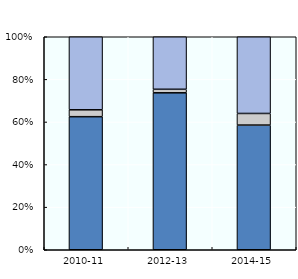
| Category | Multilateral ODA | Multi-bi/non-core | Bilateral ODA, excl. multi-bi  |
|---|---|---|---|
| 2010-11 | 2473.68 | 127.816 | 1357.79 |
| 2012-13 | 2405.488 | 54.123 | 804.938 |
| 2014-15 | 2612.444 | 242.962 | 1607.422 |